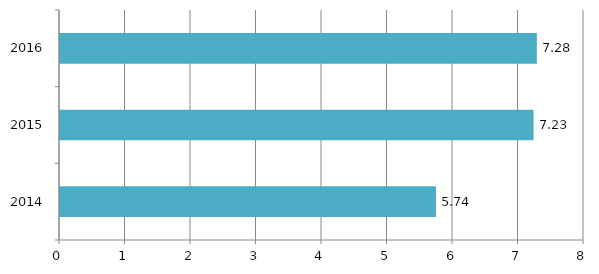
| Category | Series 0 |
|---|---|
| 2014.0 | 5.74 |
| 2015.0 | 7.23 |
| 2016.0 | 7.28 |